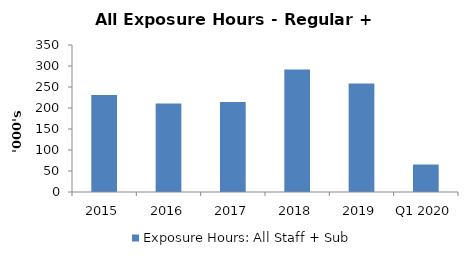
| Category | Exposure Hours: All Staff + Sub |
|---|---|
| 2015 | 231066 |
| 2016 | 210544 |
| 2017 | 214425 |
| 2018 | 291680 |
| 2019 | 258085.6 |
| Q1 2020 | 65433.3 |